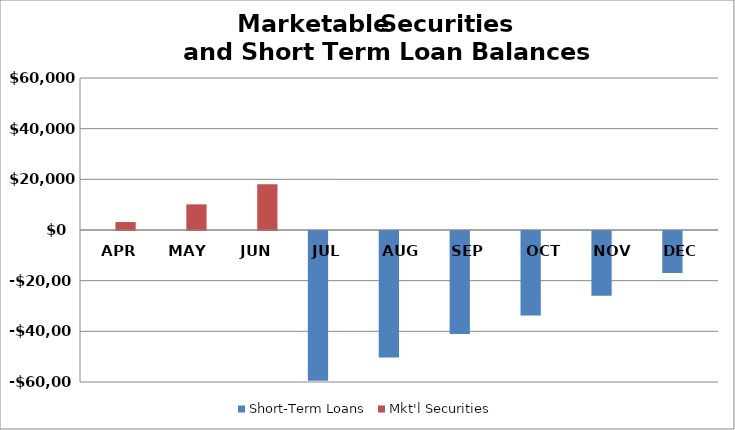
| Category | Short-Term Loans | Mkt'l Securities |
|---|---|---|
| APR | 0 | 3147 |
| MAY | 0 | 10110.75 |
| JUN | 0 | 18082.25 |
| JUL | -59116.75 | 0 |
| AUG | -49894.25 | 0 |
| SEP | -40696.75 | 0 |
| OCT | -33366.75 | 0 |
| NOV | -25551.75 | 0 |
| DEC | -16593 | 0 |